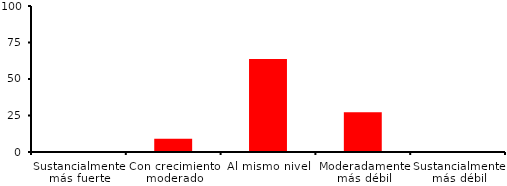
| Category | Series 0 |
|---|---|
| Sustancialmente más fuerte | 0 |
| Con crecimiento moderado | 9.091 |
| Al mismo nivel | 63.636 |
| Moderadamente más débil | 27.273 |
| Sustancialmente más débil | 0 |